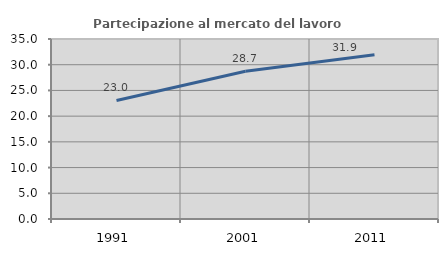
| Category | Partecipazione al mercato del lavoro  femminile |
|---|---|
| 1991.0 | 23.048 |
| 2001.0 | 28.733 |
| 2011.0 | 31.926 |